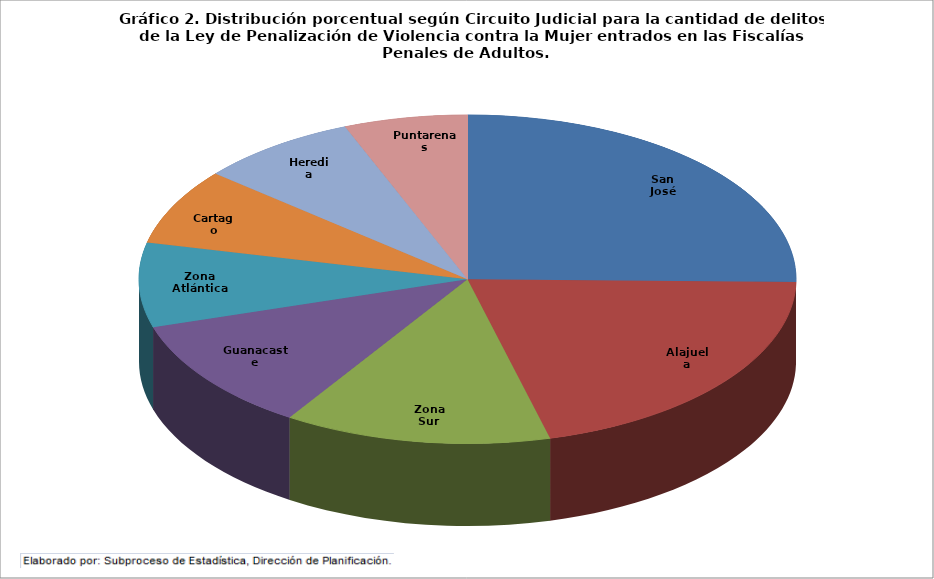
| Category | Entrada Neta |
|---|---|
| San José | 5339 |
| Alajuela | 4368 |
| Zona Sur | 2775 |
| Guanacaste | 2363 |
| Zona Atlántica | 1753 |
| Cartago | 1586 |
| Heredia | 1654 |
| Puntarenas | 1284 |